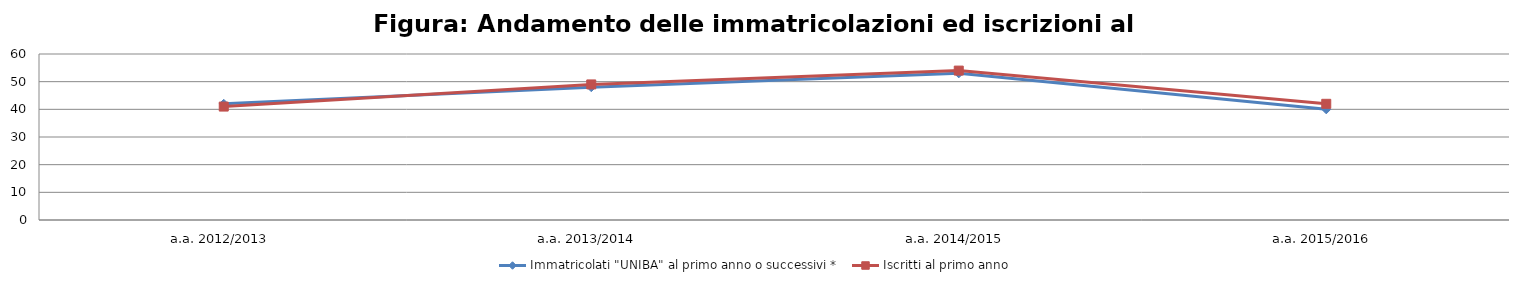
| Category | Immatricolati "UNIBA" al primo anno o successivi * | Iscritti al primo anno  |
|---|---|---|
| a.a. 2012/2013 | 42 | 41 |
| a.a. 2013/2014 | 48 | 49 |
| a.a. 2014/2015 | 53 | 54 |
| a.a. 2015/2016 | 40 | 42 |